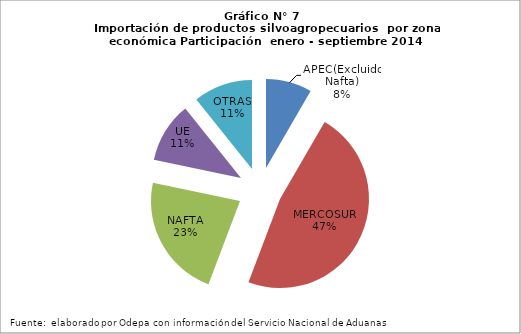
| Category | Series 0 |
|---|---|
| APEC(Excluido Nafta) | 345541.599 |
| MERCOSUR | 1959070.004 |
| NAFTA | 931201.211 |
| UE | 452284.539 |
| OTRAS | 444770.647 |